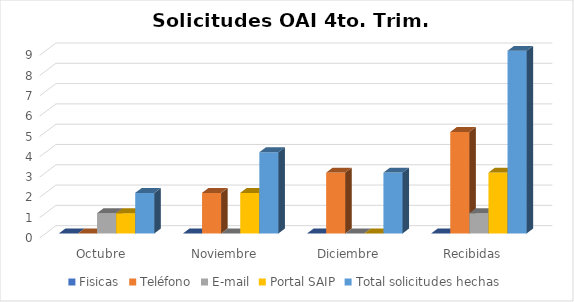
| Category | Fisicas | Teléfono | E-mail | Portal SAIP | Total solicitudes hechas |
|---|---|---|---|---|---|
| Octubre | 0 | 0 | 1 | 1 | 2 |
| Noviembre | 0 | 2 | 0 | 2 | 4 |
| Diciembre | 0 | 3 | 0 | 0 | 3 |
| Recibidas | 0 | 5 | 1 | 3 | 9 |